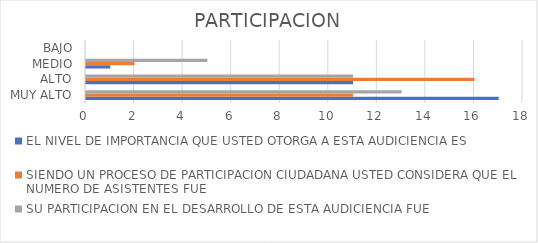
| Category | EL NIVEL DE IMPORTANCIA QUE USTED OTORGA A ESTA AUDICIENCIA ES | SIENDO UN PROCESO DE PARTICIPACION CIUDADANA USTED CONSIDERA QUE EL NUMERO DE ASISTENTES FUE | SU PARTICIPACION EN EL DESARROLLO DE ESTA AUDICIENCIA FUE |
|---|---|---|---|
| MUY ALTO | 17 | 11 | 13 |
| ALTO | 11 | 16 | 11 |
| MEDIO | 1 | 2 | 5 |
| BAJO | 0 | 0 | 0 |